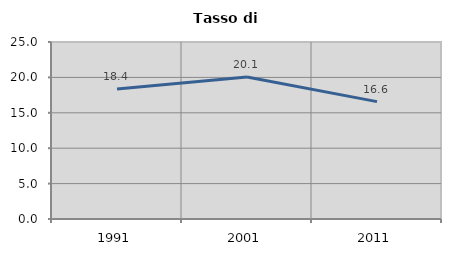
| Category | Tasso di disoccupazione   |
|---|---|
| 1991.0 | 18.378 |
| 2001.0 | 20.058 |
| 2011.0 | 16.576 |